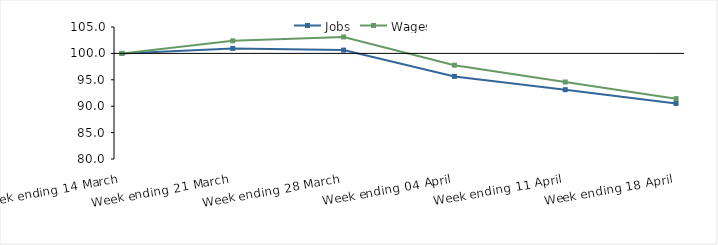
| Category | Jobs | Wages |
|---|---|---|
| 0 | 100 | 100 |
| 1900-01-01 | 100.946 | 102.378 |
| 1900-01-02 | 100.622 | 103.113 |
| 1900-01-03 | 95.645 | 97.768 |
| 1900-01-04 | 93.133 | 94.582 |
| 1900-01-05 | 90.524 | 91.431 |